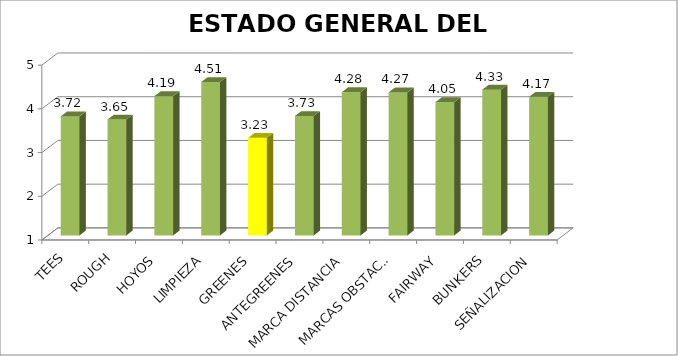
| Category | Series 0 |
|---|---|
| TEES | 3.723 |
| ROUGH | 3.652 |
| HOYOS | 4.186 |
| LIMPIEZA | 4.509 |
| GREENES | 3.231 |
| ANTEGREENES | 3.732 |
| MARCA DISTANCIA | 4.277 |
| MARCAS OBSTACULOS | 4.272 |
| FAIRWAY | 4.049 |
| BUNKERS | 4.334 |
| SEÑALIZACION | 4.171 |